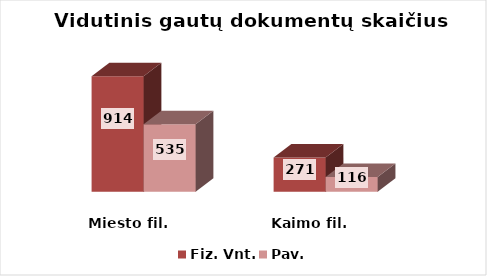
| Category | Fiz. Vnt. | Pav. |
|---|---|---|
| Miesto fil. | 914 | 535 |
| Kaimo fil. | 271 | 116 |